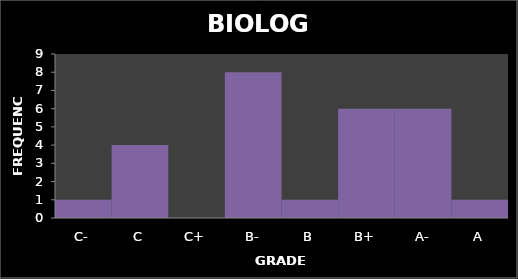
| Category | Series 0 |
|---|---|
| C- | 1 |
| C | 4 |
| C+ | 0 |
| B- | 8 |
| B | 1 |
| B+ | 6 |
| A- | 6 |
| A | 1 |